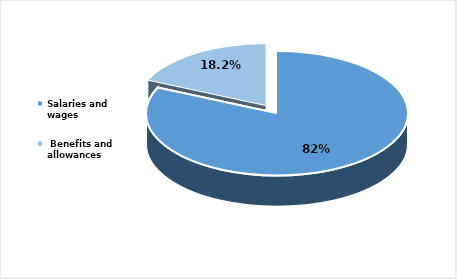
| Category | Series 0 |
|---|---|
| Salaries and wages | 0.818 |
|  Benefits and allowances  | 0.182 |